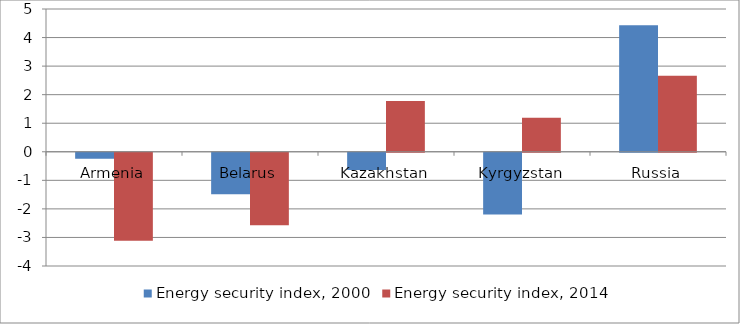
| Category | Energy security index, 2000 | Energy security index, 2014 |
|---|---|---|
| Armenia | -0.213 | -3.08 |
| Belarus | -1.453 | -2.536 |
| Kazakhstan | -0.599 | 1.78 |
| Kyrgyzstan | -2.163 | 1.187 |
| Russia | 4.427 | 2.664 |